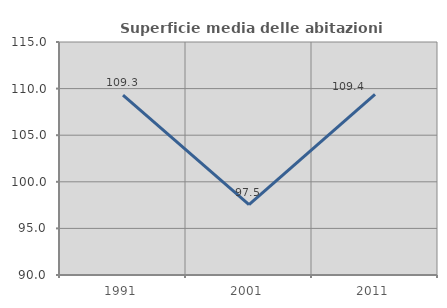
| Category | Superficie media delle abitazioni occupate |
|---|---|
| 1991.0 | 109.295 |
| 2001.0 | 97.542 |
| 2011.0 | 109.392 |